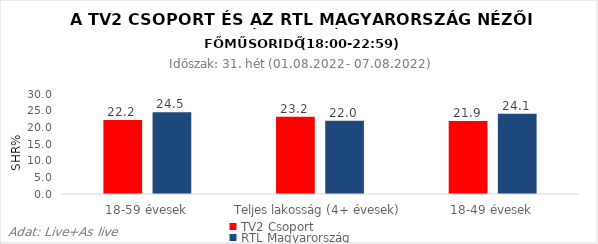
| Category | TV2 Csoport | RTL Magyarország |
|---|---|---|
| 18-59 évesek | 22.2 | 24.5 |
| Teljes lakosság (4+ évesek) | 23.2 | 22 |
| 18-49 évesek | 21.9 | 24.1 |